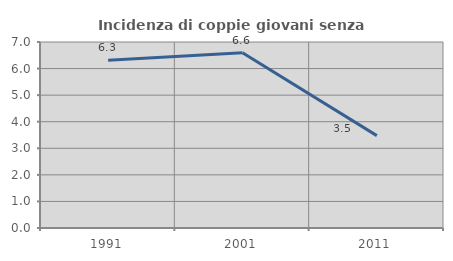
| Category | Incidenza di coppie giovani senza figli |
|---|---|
| 1991.0 | 6.31 |
| 2001.0 | 6.598 |
| 2011.0 | 3.476 |